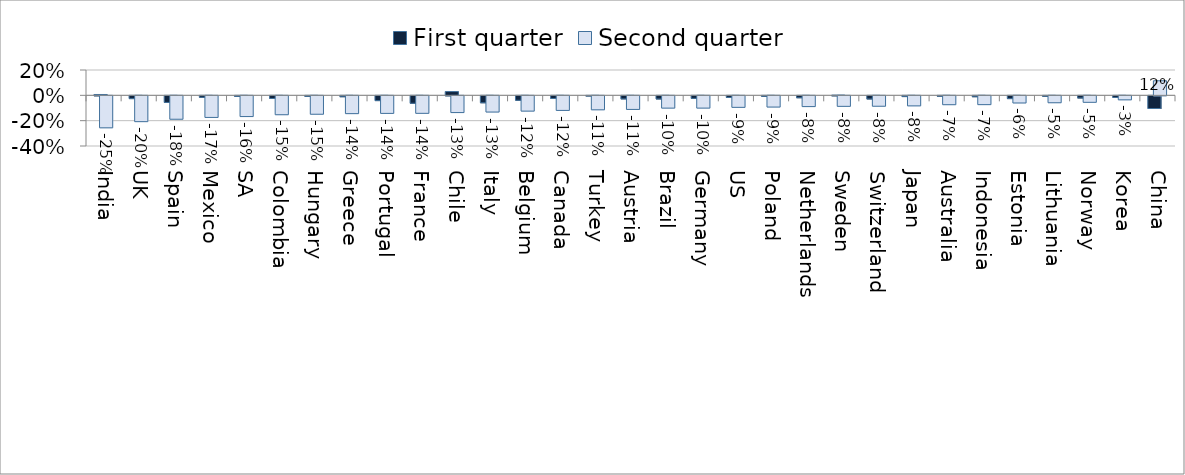
| Category | First quarter | Second quarter |
|---|---|---|
| India | 0.007 | -0.252 |
| UK | -0.022 | -0.204 |
| Spain | -0.052 | -0.185 |
| Mexico | -0.012 | -0.171 |
| SA | -0.005 | -0.164 |
| Colombia | -0.021 | -0.149 |
| Hungary | -0.004 | -0.145 |
| Greece | -0.007 | -0.14 |
| Portugal | -0.038 | -0.139 |
| France | -0.059 | -0.138 |
| Chile | 0.03 | -0.132 |
| Italy | -0.055 | -0.128 |
| Belgium | -0.035 | -0.121 |
| Canada | -0.021 | -0.115 |
| Turkey | -0.001 | -0.11 |
| Austria | -0.024 | -0.107 |
| Brazil | -0.025 | -0.097 |
| Germany | -0.02 | -0.097 |
| US | -0.013 | -0.091 |
| Poland | -0.004 | -0.089 |
| Netherlands | -0.015 | -0.085 |
| Sweden | 0.002 | -0.083 |
| Switzerland | -0.025 | -0.082 |
| Japan | -0.006 | -0.079 |
| Australia | -0.003 | -0.07 |
| Indonesia | -0.007 | -0.069 |
| Estonia | -0.022 | -0.056 |
| Lithuania | -0.003 | -0.055 |
| Norway | -0.017 | -0.051 |
| Korea | -0.013 | -0.032 |
| China | -0.1 | 0.115 |